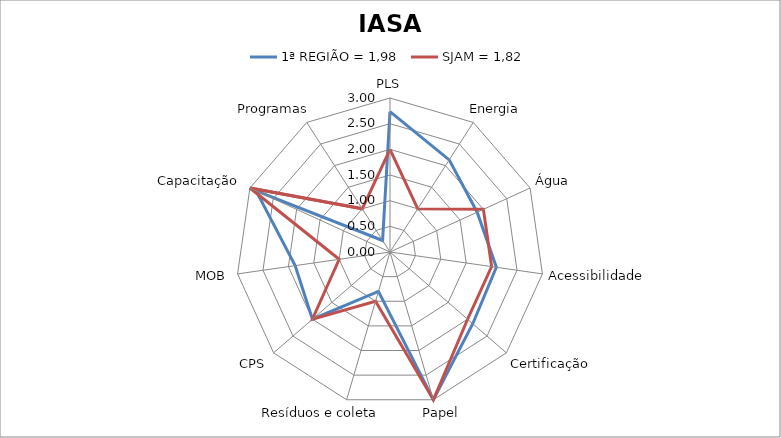
| Category | 1ª REGIÃO = 1,98 | SJAM = 1,82 |
|---|---|---|
| PLS | 2.733 | 2 |
| Energia | 2.133 | 1 |
| Água | 1.867 | 2 |
| Acessibilidade | 2.093 | 2 |
| Certificação | 2.133 | 2 |
| Papel | 3 | 3 |
| Resíduos e coleta | 0.8 | 1 |
| CPS | 2 | 2 |
| MOB | 1.867 | 1 |
| Capacitação | 2.867 | 3 |
| Programas | 0.267 | 1 |